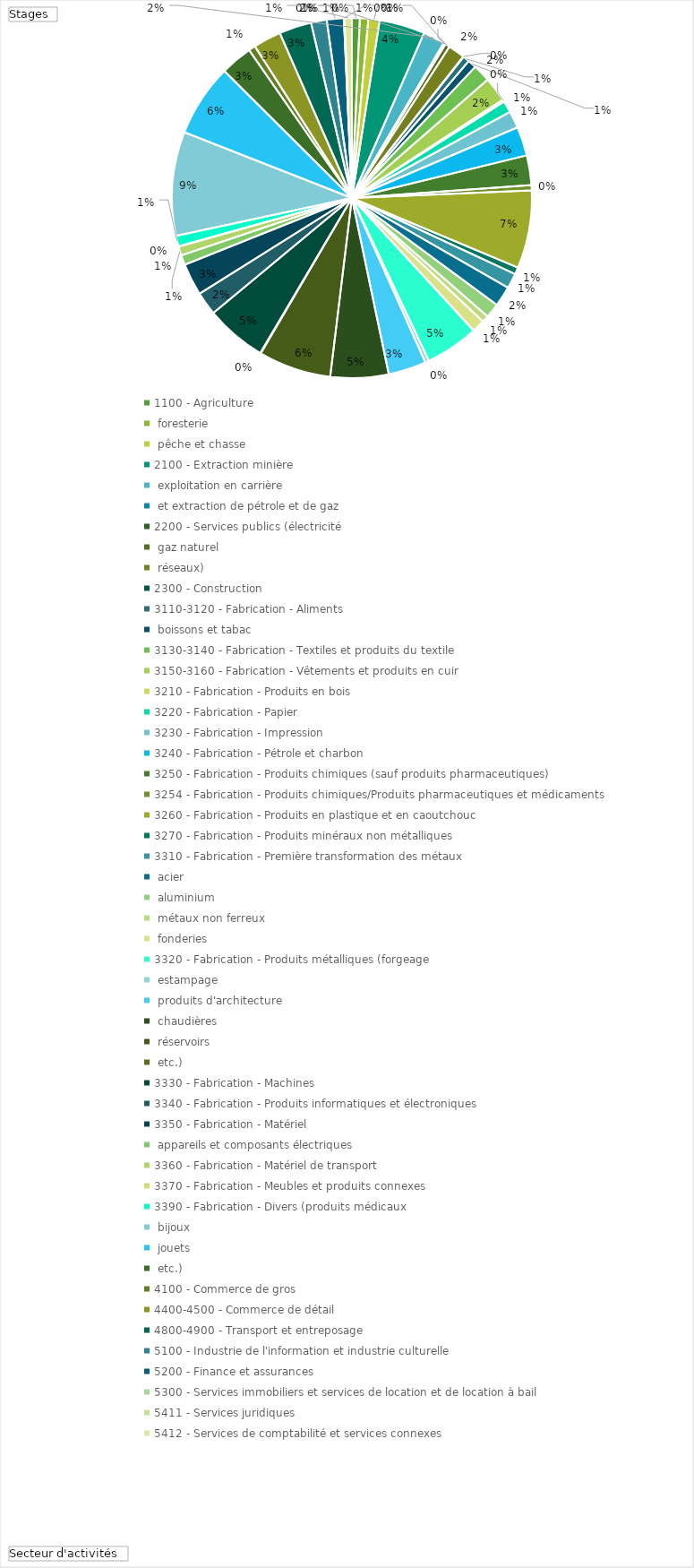
| Category | Total |
|---|---|
| 1100 - Agriculture, foresterie, pêche et chasse | 69 |
| 2100 - Extraction minière, exploitation en carrière, et extraction de pétrole et de gaz | 74 |
| 2200 - Services publics (électricité, gaz naturel, réseaux) | 99 |
| 2300 - Construction | 401 |
| 3110-3120 - Fabrication - Aliments, boissons et tabac | 191 |
| 3130-3140 - Fabrication - Textiles et produits du textile | 15 |
| 3150-3160 - Fabrication - Vêtements et produits en cuir | 3 |
| 3210 - Fabrication - Produits en bois | 41 |
| 3220 - Fabrication - Papier | 147 |
| 3230 - Fabrication - Impression | 4 |
| 3240 - Fabrication - Pétrole et charbon | 58 |
| 3250 - Fabrication - Produits chimiques (sauf produits pharmaceutiques) | 75 |
| 3254 - Fabrication - Produits chimiques/Produits pharmaceutiques et médicaments | 155 |
| 3260 - Fabrication - Produits en plastique et en caoutchouc | 218 |
| 3270 - Fabrication - Produits minéraux non métalliques | 20 |
| 3310 - Fabrication - Première transformation des métaux, acier, aluminium, métaux non ferreux, fonderies | 103 |
| 3320 - Fabrication - Produits métalliques (forgeage, estampage, produits d'architecture, chaudières, réservoirs, etc.) | 148 |
| 3330 - Fabrication - Machines | 256 |
| 3340 - Fabrication - Produits informatiques et électroniques | 261 |
| 3350 - Fabrication - Matériel, appareils et composants électriques | 46 |
| 3360 - Fabrication - Matériel de transport | 685 |
| 3370 - Fabrication - Meubles et produits connexes | 61 |
| 3390 - Fabrication - Divers (produits médicaux, bijoux, jouets, etc.) | 133 |
| 4100 - Commerce de gros | 178 |
| 4400-4500 - Commerce de détail | 128 |
| 4800-4900 - Transport et entreposage | 59 |
| 5100 - Industrie de l'information et industrie culturelle | 113 |
| 5200 - Finance et assurances | 470 |
| 5300 - Services immobiliers et services de location et de location à bail | 33 |
| 5411 - Services juridiques | 334 |
| 5412 - Services de comptabilité et services connexes | 511 |
| 5413 - Architecture, génie et services connexes | 639 |
| 5414 - Services spécialisés de design | 5 |
| 5415 - Conception de systèmes informatiques et services connexes | 537 |
| 5416 - Services de conseils en gestion et de conseils scientifiques et techniques | 206 |
| 5417 - Services de recherche et de développement scientifiques | 282 |
| 5418 - Publicité, relations publiques et services connexes | 86 |
| 5419 - Autres services professionnels, scientifiques et techniques | 80 |
| 5500 - Gestion de sociétés et d'entreprises | 2 |
| 5600 - Services administratifs, services de soutien, services de gestion des déchets et services d'assainissement | 94 |
| 6100 - Services d'enseignement | 913 |
| 6200 - Soins de santé et assistance sociale | 638 |
| 7100 - Arts, spectacles et loisirs | 281 |
| 7200 - Services d'hébergement et de restauration | 60 |
| 8100 - Autres services (sauf les administrations publiques) | 245 |
| 9110 - Administration publique - Fédérale | 285 |
| 9120 - Administrations publiques - Provinciales et territoriales | 138 |
| 9130 - Administrations publiques - Locales, municipales et régionales | 150 |
| 9140 - Administrations publiques - Communautés autochtones | 1 |
| 9190 - Administration publique - Organismes publics internationaux ou extra-territoriaux | 4 |
| 9998 - À déterminer | 65 |